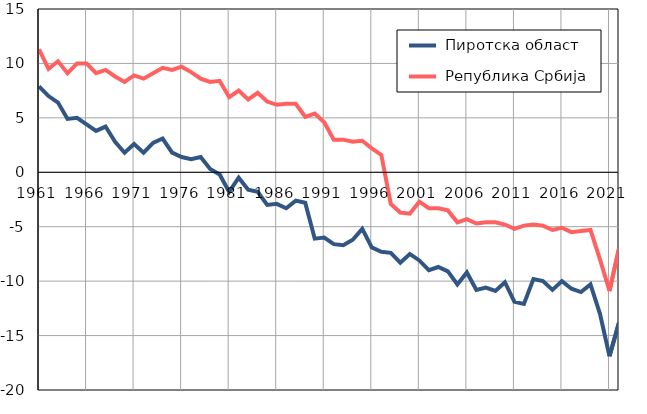
| Category |  Пиротска област |  Република Србија |
|---|---|---|
| 1961.0 | 7.9 | 11.3 |
| 1962.0 | 7 | 9.5 |
| 1963.0 | 6.4 | 10.2 |
| 1964.0 | 4.9 | 9.1 |
| 1965.0 | 5 | 10 |
| 1966.0 | 4.4 | 10 |
| 1967.0 | 3.8 | 9.1 |
| 1968.0 | 4.2 | 9.4 |
| 1969.0 | 2.8 | 8.8 |
| 1970.0 | 1.8 | 8.3 |
| 1971.0 | 2.6 | 8.9 |
| 1972.0 | 1.8 | 8.6 |
| 1973.0 | 2.7 | 9.1 |
| 1974.0 | 3.1 | 9.6 |
| 1975.0 | 1.8 | 9.4 |
| 1976.0 | 1.4 | 9.7 |
| 1977.0 | 1.2 | 9.2 |
| 1978.0 | 1.4 | 8.6 |
| 1979.0 | 0.3 | 8.3 |
| 1980.0 | -0.2 | 8.4 |
| 1981.0 | -1.8 | 6.9 |
| 1982.0 | -0.5 | 7.5 |
| 1983.0 | -1.6 | 6.7 |
| 1984.0 | -1.8 | 7.3 |
| 1985.0 | -3 | 6.5 |
| 1986.0 | -2.9 | 6.2 |
| 1987.0 | -3.3 | 6.3 |
| 1988.0 | -2.6 | 6.3 |
| 1989.0 | -2.8 | 5.1 |
| 1990.0 | -6.1 | 5.4 |
| 1991.0 | -6 | 4.6 |
| 1992.0 | -6.6 | 3 |
| 1993.0 | -6.7 | 3 |
| 1994.0 | -6.2 | 2.8 |
| 1995.0 | -5.2 | 2.9 |
| 1996.0 | -6.9 | 2.2 |
| 1997.0 | -7.3 | 1.6 |
| 1998.0 | -7.4 | -2.9 |
| 1999.0 | -8.3 | -3.7 |
| 2000.0 | -7.5 | -3.8 |
| 2001.0 | -8.1 | -2.7 |
| 2002.0 | -9 | -3.3 |
| 2003.0 | -8.7 | -3.3 |
| 2004.0 | -9.1 | -3.5 |
| 2005.0 | -10.3 | -4.6 |
| 2006.0 | -9.2 | -4.3 |
| 2007.0 | -10.8 | -4.7 |
| 2008.0 | -10.6 | -4.6 |
| 2009.0 | -10.9 | -4.6 |
| 2010.0 | -10.1 | -4.8 |
| 2011.0 | -11.9 | -5.2 |
| 2012.0 | -12.1 | -4.9 |
| 2013.0 | -9.8 | -4.8 |
| 2014.0 | -10 | -4.9 |
| 2015.0 | -10.8 | -5.3 |
| 2016.0 | -10 | -5.1 |
| 2017.0 | -10.7 | -5.5 |
| 2018.0 | -11 | -5.4 |
| 2019.0 | -10.3 | -5.3 |
| 2020.0 | -13 | -8 |
| 2021.0 | -16.9 | -10.9 |
| 2022.0 | -13.8 | -7 |